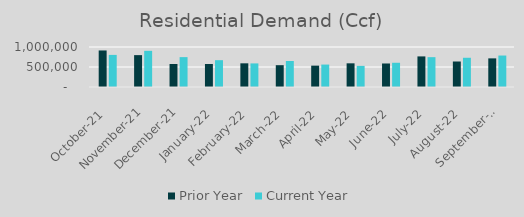
| Category | Prior Year | Current Year |
|---|---|---|
| 2021-10-01 | 913450.318 | 802383.882 |
| 2021-11-01 | 796803.85 | 904247.352 |
| 2021-12-01 | 575698.992 | 746791.488 |
| 2022-01-01 | 574964.407 | 670556.394 |
| 2022-02-01 | 591912.627 | 589693.822 |
| 2022-03-01 | 545392.69 | 650741.307 |
| 2022-04-01 | 533967.423 | 560920.541 |
| 2022-05-01 | 591911.753 | 528033 |
| 2022-06-01 | 587861.265 | 605957.158 |
| 2022-07-01 | 764849.567 | 746133 |
| 2022-08-01 | 637451.79 | 730870.571 |
| 2022-09-01 | 715703.433 | 786683 |